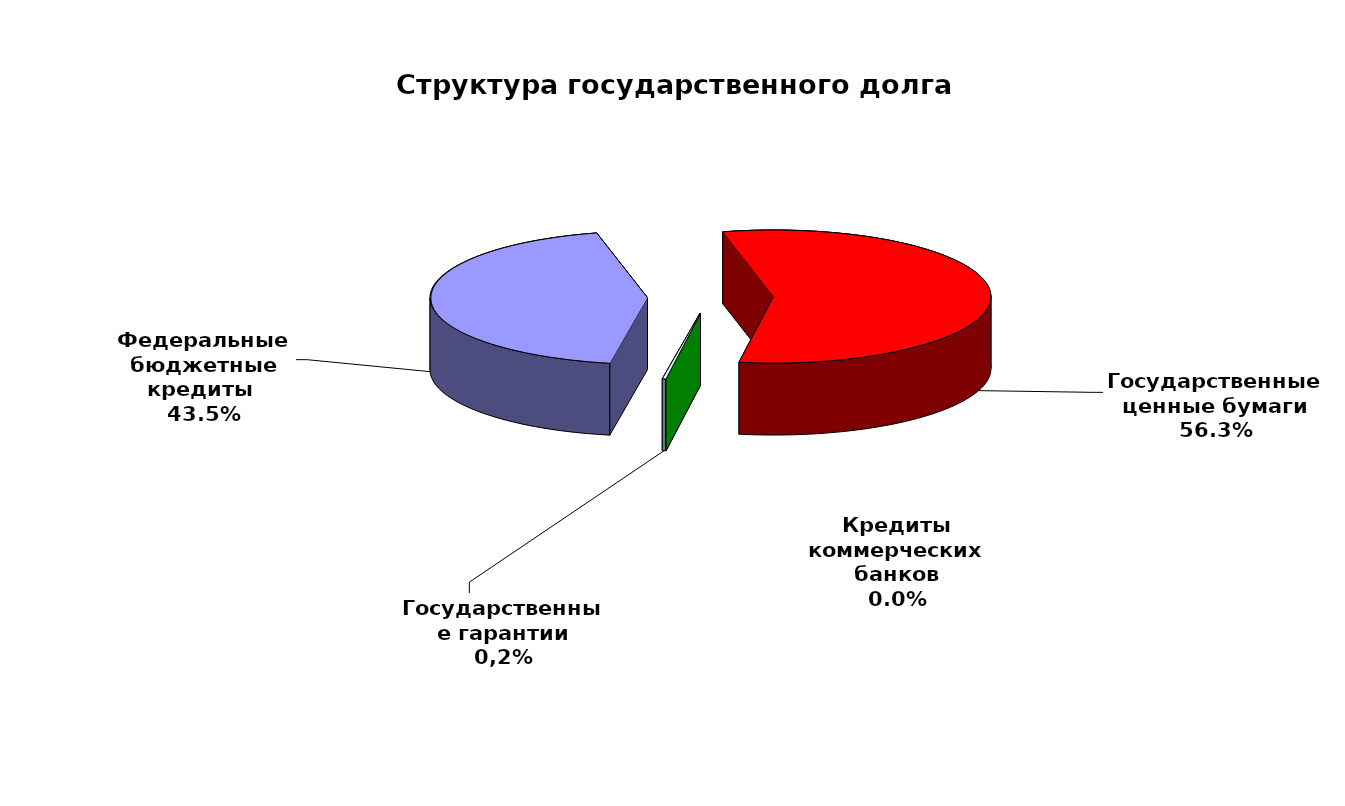
| Category | Series 0 |
|---|---|
| Федеральные бюджетные кредиты  | 28654967.463 |
| Государственные ценные бумаги | 37100000 |
| Кредиты коммерческих банков | 0 |
| Государственные гарантии | 158212.22 |